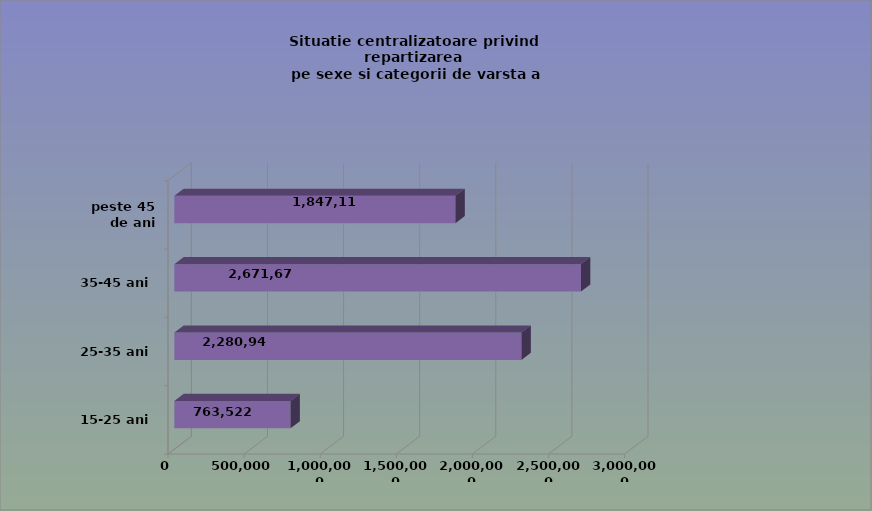
| Category | 15-25 ani 25-35 ani 35-45 ani peste 45 de ani |
|---|---|
| 15-25 ani | 763522 |
| 25-35 ani | 2280948 |
| 35-45 ani | 2671677 |
| peste 45 de ani | 1847112 |